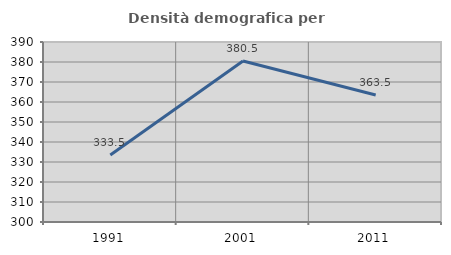
| Category | Densità demografica |
|---|---|
| 1991.0 | 333.46 |
| 2001.0 | 380.479 |
| 2011.0 | 363.517 |